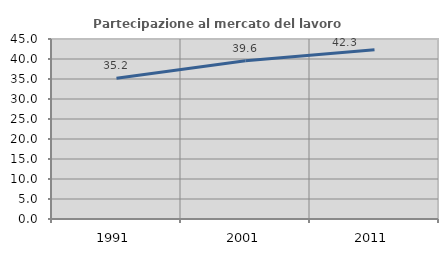
| Category | Partecipazione al mercato del lavoro  femminile |
|---|---|
| 1991.0 | 35.206 |
| 2001.0 | 39.571 |
| 2011.0 | 42.324 |